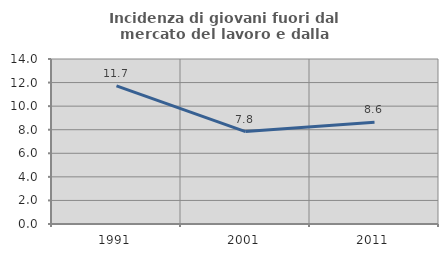
| Category | Incidenza di giovani fuori dal mercato del lavoro e dalla formazione  |
|---|---|
| 1991.0 | 11.715 |
| 2001.0 | 7.843 |
| 2011.0 | 8.642 |